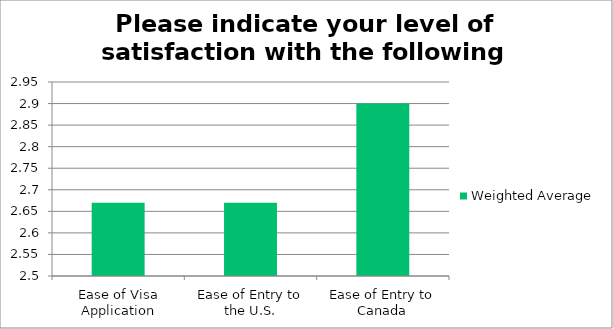
| Category | Weighted Average |
|---|---|
| Ease of Visa Application | 2.67 |
| Ease of Entry to the U.S. | 2.67 |
| Ease of Entry to Canada | 2.9 |